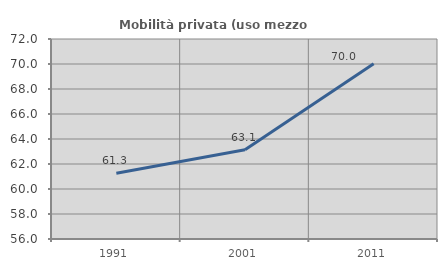
| Category | Mobilità privata (uso mezzo privato) |
|---|---|
| 1991.0 | 61.266 |
| 2001.0 | 63.138 |
| 2011.0 | 70.016 |